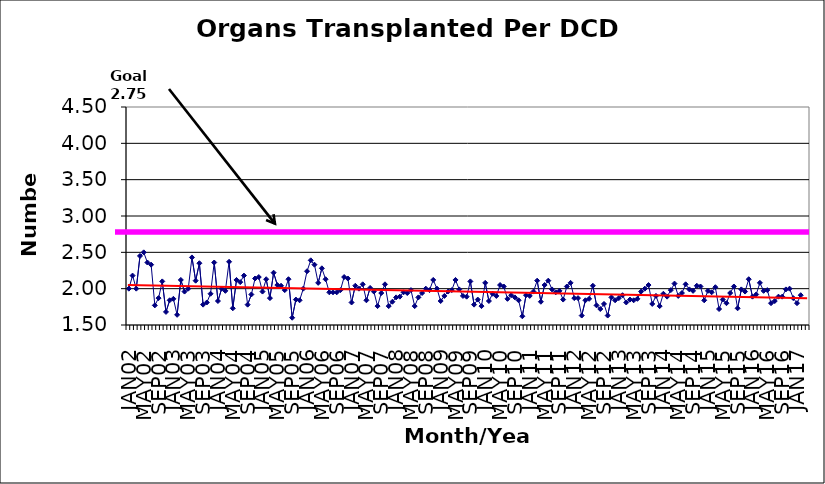
| Category | Series 0 |
|---|---|
| JAN02 | 2 |
| FEB02 | 2.18 |
| MAR02 | 2 |
| APR02 | 2.45 |
| MAY02 | 2.5 |
| JUN02 | 2.36 |
| JUL02 | 2.33 |
| AUG02 | 1.77 |
| SEP02 | 1.87 |
| OCT02 | 2.1 |
| NOV02 | 1.68 |
| DEC02 | 1.84 |
| JAN03 | 1.86 |
| FEB03 | 1.64 |
| MAR03 | 2.12 |
| APR03 | 1.96 |
| MAY03 | 2 |
| JUN03 | 2.43 |
| JUL03 | 2.11 |
| AUG03 | 2.35 |
| SEP03 | 1.78 |
| OCT03 | 1.81 |
| NOV03 | 1.93 |
| DEC03 | 2.36 |
| JAN04 | 1.83 |
| FEB04 | 2 |
| MAR04 | 1.97 |
| APR04 | 2.37 |
| MAY04 | 1.73 |
| JUN04 | 2.12 |
| JUL04 | 2.09 |
| AUG04 | 2.18 |
| SEP04 | 1.78 |
| OCT04 | 1.92 |
| NOV04 | 2.14 |
| DEC04 | 2.16 |
| JAN05 | 1.96 |
| FEB05 | 2.13 |
| MAR05 | 1.87 |
| APR05 | 2.22 |
| MAY05 | 2.05 |
| JUN05 | 2.04 |
| JUL05 | 1.98 |
| AUG05 | 2.13 |
| SEP05 | 1.6 |
| OCT05 | 1.85 |
| NOV05 | 1.84 |
| DEC05 | 2 |
| JAN06 | 2.24 |
| FEB06 | 2.39 |
| MAR06 | 2.33 |
| APR06 | 2.08 |
| MAY06 | 2.28 |
| JUN06 | 2.13 |
| JUL06 | 1.95 |
| AUG06 | 1.95 |
| SEP06 | 1.95 |
| OCT06 | 1.98 |
| NOV06 | 2.16 |
| DEC06 | 2.14 |
| JAN07 | 1.81 |
| FEB07 | 2.04 |
| MAR07 | 2 |
| APR07 | 2.06 |
| MAY07 | 1.84 |
| JUN07 | 2.01 |
| JUL07 | 1.96 |
| AUG07 | 1.76 |
| SEP07 | 1.94 |
| OCT07 | 2.06 |
| NOV07 | 1.76 |
| DEC07 | 1.82 |
| JAN08 | 1.88 |
| FEB08 | 1.89 |
| MAR08 | 1.95 |
| APR08 | 1.94 |
| MAY08 | 1.98 |
| JUN08 | 1.76 |
| JUL08 | 1.88 |
| AUG08 | 1.94 |
| SEP08 | 2 |
| OCT08 | 1.98 |
| NOV08 | 2.12 |
| DEC08 | 2 |
| JAN09 | 1.83 |
| FEB09 | 1.9 |
| MAR09 | 1.96 |
| APR09 | 1.98 |
| MAY09 | 2.12 |
| JUN09 | 1.99 |
| JUL09 | 1.9 |
| AUG09 | 1.89 |
| SEP09 | 2.1 |
| OCT09 | 1.78 |
| NOV09 | 1.85 |
| DEC09 | 1.76 |
| JAN10 | 2.08 |
| FEB10 | 1.83 |
| MAR10 | 1.93 |
| APR10 | 1.9 |
| MAY10 | 2.05 |
| JUN10 | 2.03 |
| JUL10 | 1.86 |
| AUG10 | 1.91 |
| SEP10 | 1.88 |
| OCT10 | 1.84 |
| NOV10 | 1.62 |
| DEC10 | 1.91 |
| JAN11 | 1.9 |
| FEB11 | 1.96 |
| MAR11 | 2.11 |
| APR11 | 1.82 |
| MAY11 | 2.05 |
| JUN11 | 2.11 |
| JUL11 | 1.99 |
| AUG11 | 1.95 |
| SEP11 | 1.97 |
| OCT11 | 1.85 |
| NOV11 | 2.03 |
| DEC11 | 2.08 |
| JAN12 | 1.87 |
| FEB12 | 1.87 |
| MAR12 | 1.63 |
| APR12 | 1.84 |
| MAY12 | 1.86 |
| JUN12 | 2.04 |
| JUL12 | 1.77 |
| AUG12 | 1.72 |
| SEP12 | 1.79 |
| OCT12 | 1.63 |
| NOV12 | 1.88 |
| DEC12 | 1.84 |
| JAN13 | 1.87 |
| FEB13 | 1.91 |
| MAR13 | 1.81 |
| APR13 | 1.85 |
| MAY13 | 1.84 |
| JUN13 | 1.86 |
| JUL13 | 1.96 |
| AUG13 | 2 |
| SEP13 | 2.05 |
| OCT13 | 1.79 |
| NOV13 | 1.9 |
| DEC13 | 1.76 |
| JAN14 | 1.93 |
| FEB14 | 1.89 |
| MAR14 | 1.98 |
| APR14 | 2.07 |
| MAY14 | 1.9 |
| JUN14 | 1.94 |
| JUL14 | 2.06 |
| AUG14 | 1.99 |
| SEP14 | 1.97 |
| OCT14 | 2.04 |
| NOV14 | 2.03 |
| DEC14 | 1.84 |
| JAN15 | 1.97 |
| FEB15 | 1.95 |
| MAR15 | 2.02 |
| APR15 | 1.72 |
| MAY15 | 1.85 |
| JUN15 | 1.8 |
| JUL15 | 1.94 |
| AUG15 | 2.03 |
| SEP15 | 1.73 |
| OCT15 | 1.99 |
| NOV15 | 1.96 |
| DEC15 | 2.13 |
| JAN16 | 1.89 |
| FEB16 | 1.92 |
| MAR16 | 2.08 |
| APR16 | 1.97 |
| MAY16 | 1.98 |
| JUN16 | 1.8 |
| JUL16 | 1.83 |
| AUG16 | 1.89 |
| SEP16 | 1.89 |
| OCT16 | 1.99 |
| NOV16 | 2 |
| DEC16 | 1.87 |
| JAN17 | 1.8 |
| FEB17 | 1.91 |